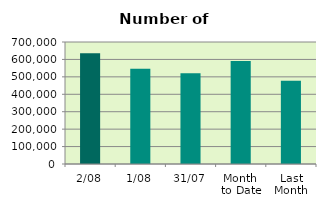
| Category | Series 0 |
|---|---|
| 2/08 | 635930 |
| 1/08 | 546384 |
| 31/07 | 521010 |
| Month 
to Date | 591157 |
| Last
Month | 477777.545 |